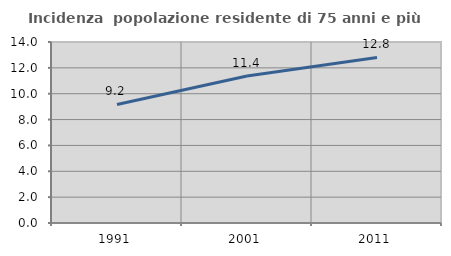
| Category | Incidenza  popolazione residente di 75 anni e più |
|---|---|
| 1991.0 | 9.166 |
| 2001.0 | 11.366 |
| 2011.0 | 12.806 |